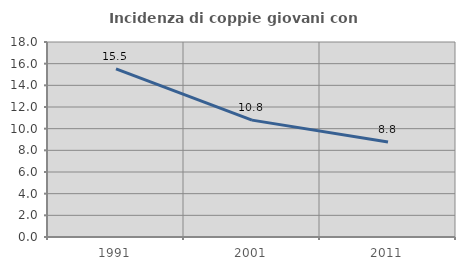
| Category | Incidenza di coppie giovani con figli |
|---|---|
| 1991.0 | 15.52 |
| 2001.0 | 10.788 |
| 2011.0 | 8.767 |